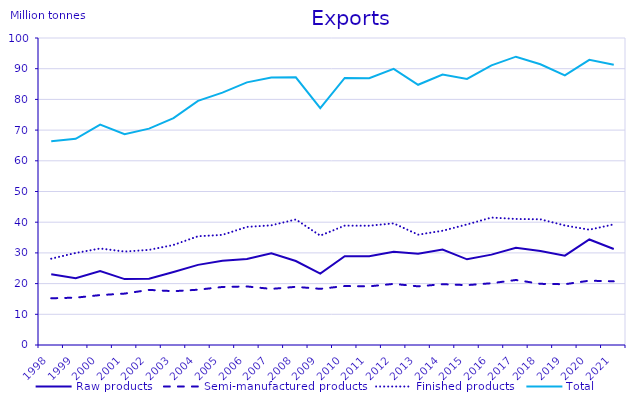
| Category | Raw products | Semi-manufactured products | Finished products | Total |
|---|---|---|---|---|
| 1998.0 | 23.014 | 15.225 | 28.118 | 66.356 |
| 1999.0 | 21.768 | 15.418 | 29.983 | 67.169 |
| 2000.0 | 24.092 | 16.259 | 31.435 | 71.786 |
| 2001.0 | 21.458 | 16.744 | 30.44 | 68.642 |
| 2002.0 | 21.553 | 17.952 | 30.983 | 70.488 |
| 2003.0 | 23.794 | 17.523 | 32.59 | 73.906 |
| 2004.0 | 26.099 | 18.01 | 35.421 | 79.53 |
| 2005.0 | 27.44 | 18.905 | 35.877 | 82.222 |
| 2006.0 | 28.008 | 19.074 | 38.469 | 85.551 |
| 2007.0 | 29.901 | 18.267 | 38.976 | 87.144 |
| 2008.0 | 27.364 | 18.951 | 40.893 | 87.208 |
| 2009.0 | 23.233 | 18.287 | 35.626 | 77.145 |
| 2010.0 | 28.899 | 19.203 | 38.89 | 86.992 |
| 2011.0 | 28.913 | 19.112 | 38.848 | 86.873 |
| 2012.0 | 30.4 | 19.907 | 39.63 | 89.938 |
| 2013.0 | 29.709 | 19.106 | 35.945 | 84.76 |
| 2014.0 | 31.1 | 19.806 | 37.203 | 88.109 |
| 2015.0 | 27.91 | 19.502 | 39.273 | 86.686 |
| 2016.0 | 29.44 | 20.124 | 41.517 | 91.081 |
| 2017.0 | 31.692 | 21.176 | 41.047 | 93.916 |
| 2018.0 | 30.59 | 19.922 | 40.949 | 91.46 |
| 2019.0 | 29.098 | 19.797 | 38.933 | 87.828 |
| 2020.0 | 34.37 | 20.951 | 37.553 | 92.874 |
| 2021.0 | 31.272 | 20.745 | 39.295 | 91.312 |